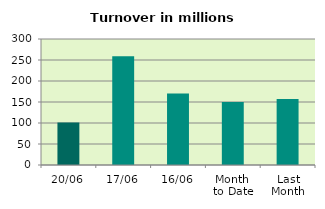
| Category | Series 0 |
|---|---|
| 20/06 | 101.441 |
| 17/06 | 259.175 |
| 16/06 | 170.141 |
| Month 
to Date | 150.036 |
| Last
Month | 157.265 |